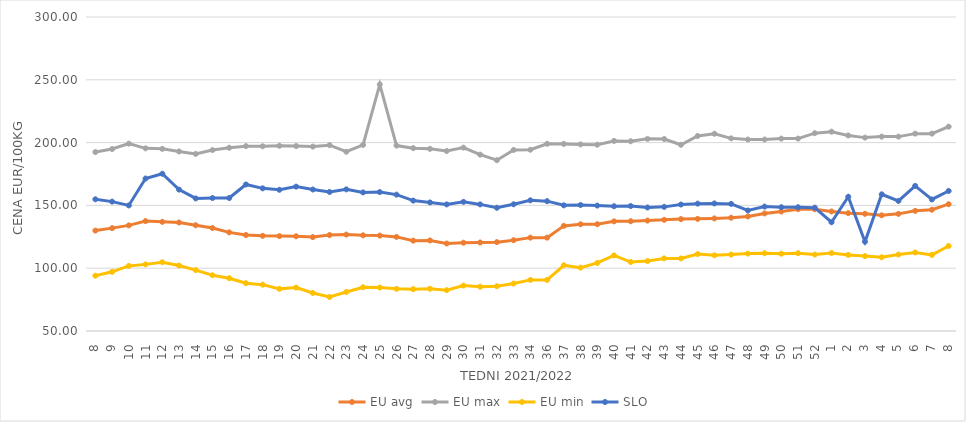
| Category | EU avg | EU max | EU min | SLO |
|---|---|---|---|---|
| 8.0 | 129.933 | 192.48 | 94.02 | 154.86 |
| 9.0 | 131.908 | 194.884 | 97.12 | 153 |
| 10.0 | 134.098 | 199.17 | 101.79 | 149.98 |
| 11.0 | 137.49 | 195.419 | 103.05 | 171.4 |
| 12.0 | 136.929 | 195.013 | 104.76 | 175.2 |
| 13.0 | 136.39 | 192.952 | 102.11 | 162.57 |
| 14.0 | 134.198 | 191.034 | 98.5 | 155.55 |
| 15.0 | 132.003 | 194.047 | 94.39 | 155.88 |
| 16.0 | 128.53 | 195.913 | 92.04 | 155.88 |
| 17.0 | 126.415 | 197.188 | 88.07 | 166.66 |
| 18.0 | 125.787 | 197.055 | 86.89 | 163.58 |
| 19.0 | 125.54 | 197.478 | 83.546 | 162.44 |
| 20.0 | 125.412 | 197.263 | 84.55 | 164.94 |
| 21.0 | 124.768 | 196.821 | 80.264 | 162.64 |
| 22.0 | 126.43 | 197.963 | 77.048 | 160.68 |
| 23.0 | 126.76 | 192.72 | 81.087 | 162.75 |
| 24.0 | 126.19 | 198.186 | 84.83 | 160.34 |
| 25.0 | 125.97 | 246.36 | 84.63 | 160.6 |
| 26.0 | 124.92 | 197.607 | 83.57 | 158.57 |
| 27.0 | 121.922 | 195.566 | 83.3 | 153.83 |
| 28.0 | 122.106 | 195.043 | 83.64 | 152.35 |
| 29.0 | 119.659 | 193.272 | 82.49 | 150.79 |
| 30.0 | 120.3 | 196.01 | 86.16 | 152.82 |
| 31.0 | 120.473 | 190.42 | 85.26 | 150.8 |
| 32.0 | 120.756 | 186 | 85.65 | 148.1 |
| 33.0 | 122.274 | 194.145 | 87.8 | 150.88 |
| 34.0 | 124.332 | 194.304 | 90.69 | 154.04 |
| 36.0 | 124.332 | 199.06 | 90.69 | 153.37 |
| 37.0 | 133.685 | 198.97 | 102.334 | 150.06 |
| 38.0 | 134.959 | 198.57 | 100.43 | 150.32 |
| 39.0 | 135.021 | 198.3 | 104.21 | 149.86 |
| 40.0 | 137.315 | 201.34 | 110.15 | 149.34 |
| 41.0 | 137.411 | 201.081 | 104.9 | 149.48 |
| 42.0 | 137.908 | 202.98 | 105.65 | 148.32 |
| 43.0 | 138.52 | 202.856 | 107.8 | 148.83 |
| 44.0 | 139.076 | 198.26 | 107.75 | 150.69 |
| 45.0 | 139.275 | 205.257 | 111.25 | 151.41 |
| 46.0 | 139.626 | 207.046 | 110.26 | 151.56 |
| 47.0 | 140.17 | 203.387 | 110.83 | 151.2 |
| 48.0 | 141.2 | 202.42 | 111.62 | 145.97 |
| 49.0 | 143.614 | 202.45 | 111.89 | 149.07 |
| 50.0 | 145.101 | 203.17 | 111.54 | 148.55 |
| 51.0 | 146.984 | 203.17 | 111.93 | 148.54 |
| 52.0 | 146.958 | 207.5 | 110.85 | 148.22 |
| 1.0 | 145.157 | 208.7 | 112.04 | 136.59 |
| 2.0 | 143.842 | 205.67 | 110.59 | 156.88 |
| 3.0 | 143.324 | 203.97 | 109.62 | 121.07 |
| 4.0 | 142.105 | 204.76 | 108.71 | 158.82 |
| 5.0 | 143.269 | 204.76 | 110.86 | 153.55 |
| 6.0 | 145.648 | 207.14 | 112.52 | 165.51 |
| 7.0 | 146.545 | 207.14 | 110.619 | 154.74 |
| 8.0 | 150.956 | 212.7 | 117.709 | 161.48 |